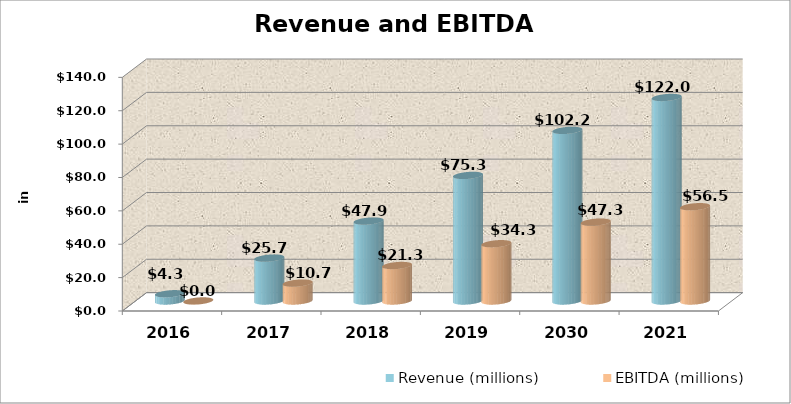
| Category | Revenue (millions) | EBITDA (millions) |
|---|---|---|
| 2016.0 | 4.346 | 0.031 |
| 2017.0 | 25.711 | 10.717 |
| 2018.0 | 47.9 | 21.272 |
| 2019.0 | 75.256 | 34.326 |
| 2030.0 | 102.248 | 47.26 |
| 2021.0 | 121.959 | 56.506 |